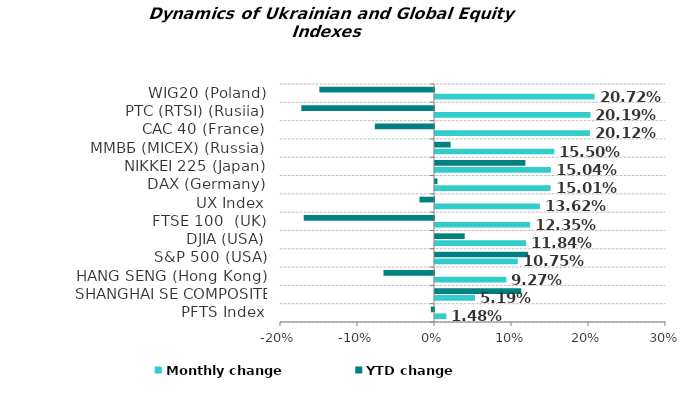
| Category | Monthly change | YTD change |
|---|---|---|
| PFTS Index | 0.015 | -0.004 |
| SHANGHAI SE COMPOSITE (China) | 0.052 | 0.112 |
| HANG SENG (Hong Kong) | 0.093 | -0.066 |
| S&P 500 (USA) | 0.108 | 0.121 |
| DJIA (USA) | 0.118 | 0.039 |
| FTSE 100  (UK) | 0.124 | -0.169 |
| UX Index | 0.136 | -0.019 |
| DAX (Germany) | 0.15 | 0.003 |
| NIKKEI 225 (Japan) | 0.15 | 0.117 |
| ММВБ (MICEX) (Russia) | 0.155 | 0.02 |
| CAC 40 (France) | 0.201 | -0.077 |
| РТС (RTSI) (Rusiia) | 0.202 | -0.172 |
| WIG20 (Poland) | 0.207 | -0.149 |